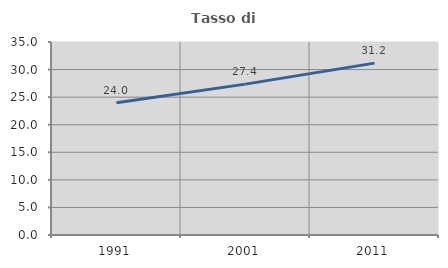
| Category | Tasso di occupazione   |
|---|---|
| 1991.0 | 23.971 |
| 2001.0 | 27.359 |
| 2011.0 | 31.172 |